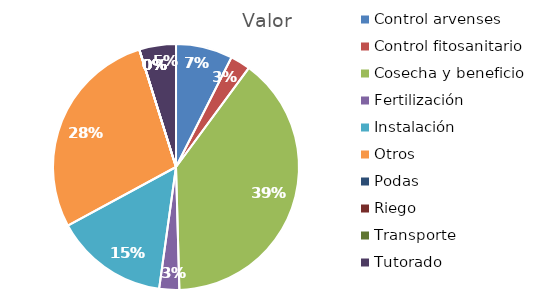
| Category | Valor |
|---|---|
| Control arvenses | 595000 |
| Control fitosanitario | 210000 |
| Cosecha y beneficio | 3150000 |
| Fertilización | 210000 |
| Instalación | 1190000 |
| Otros | 2240000 |
| Podas | 0 |
| Riego | 0 |
| Transporte | 0 |
| Tutorado | 385000 |